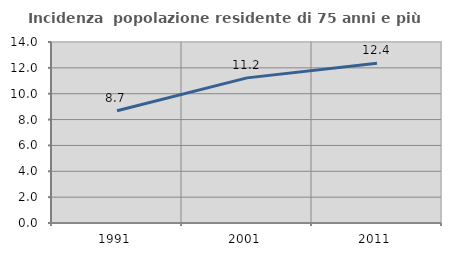
| Category | Incidenza  popolazione residente di 75 anni e più |
|---|---|
| 1991.0 | 8.677 |
| 2001.0 | 11.226 |
| 2011.0 | 12.359 |